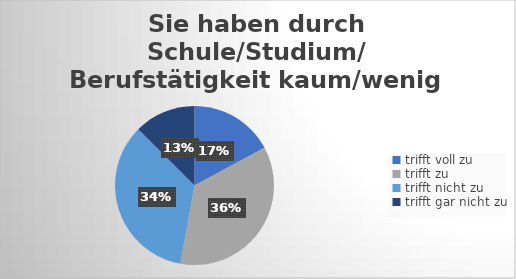
| Category | Sie haben durch Schule/Studium/ Berufstätigkeit kaum/wenig Freizeit. |
|---|---|
| trifft voll zu | 48 |
| trifft zu  | 100 |
| trifft nicht zu  | 97 |
| trifft gar nicht zu | 35 |